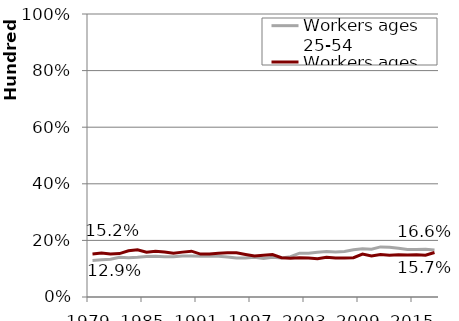
| Category | Workers ages 25-54 | Workers ages 55-64 |
|---|---|---|
| 1979.0 | 12.92 | 15.22 |
| 1980.0 | 13.13 | 15.52 |
| 1981.0 | 13.32 | 15.18 |
| 1982.0 | 14.06 | 15.33 |
| 1983.0 | 13.89 | 16.31 |
| 1984.0 | 14.05 | 16.69 |
| 1985.0 | 14.31 | 15.82 |
| 1986.0 | 14.4 | 16.19 |
| 1987.0 | 14.19 | 15.93 |
| 1988.0 | 14.24 | 15.43 |
| 1989.0 | 14.46 | 15.86 |
| 1990.0 | 14.47 | 16.19 |
| 1991.0 | 14.42 | 15.16 |
| 1992.0 | 14.43 | 15.2 |
| 1993.0 | 14.4 | 15.5 |
| 1994.0 | 14.17 | 15.62 |
| 1995.0 | 13.78 | 15.6 |
| 1996.0 | 13.77 | 15.03 |
| 1997.0 | 14.08 | 14.46 |
| 1998.0 | 13.63 | 14.72 |
| 1999.0 | 14.07 | 15 |
| 2000.0 | 13.8 | 13.9 |
| 2001.0 | 14.25 | 13.71 |
| 2002.0 | 15.47 | 13.89 |
| 2003.0 | 15.44 | 13.8 |
| 2004.0 | 15.78 | 13.56 |
| 2005.0 | 16.06 | 14.05 |
| 2006.0 | 15.91 | 13.8 |
| 2007.0 | 16.05 | 13.8 |
| 2008.0 | 16.67 | 13.9 |
| 2009.0 | 17.07 | 15.15 |
| 2010.0 | 16.86 | 14.46 |
| 2011.0 | 17.7 | 15 |
| 2012.0 | 17.6 | 14.74 |
| 2013.0 | 17.2 | 14.9 |
| 2014.0 | 16.79 | 14.87 |
| 2015.0 | 16.79 | 14.92 |
| 2016.0 | 16.88 | 14.75 |
| 2017.0 | 16.6 | 15.74 |